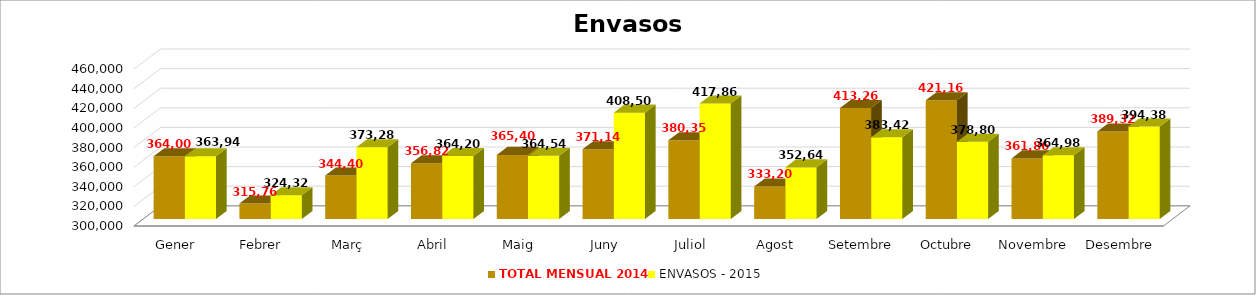
| Category | TOTAL MENSUAL 2014 | ENVASOS - 2015 |
|---|---|---|
| Gener | 363999.98 | 363940 |
| Febrer | 315760.03 | 324319.96 |
| Març | 344400 | 373279.99 |
| Abril | 356820 | 364199.99 |
| Maig | 365399.97 | 364539.99 |
| Juny | 371140.03 | 408500 |
| Juliol | 380350 | 417860.01 |
| Agost | 333200 | 352640.04 |
| Setembre | 413260 | 383420 |
| Octubre | 421160 | 378801.14 |
| Novembre | 361860 | 364979.89 |
| Desembre | 389319.99 | 394379.98 |